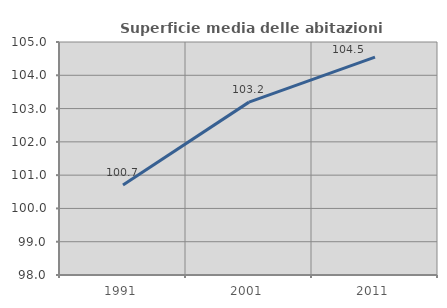
| Category | Superficie media delle abitazioni occupate |
|---|---|
| 1991.0 | 100.702 |
| 2001.0 | 103.194 |
| 2011.0 | 104.545 |